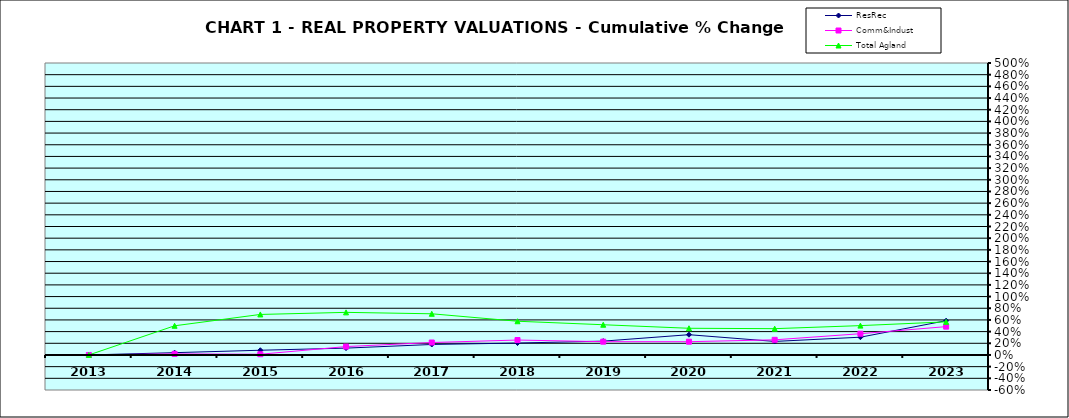
| Category | ResRec | Comm&Indust | Total Agland |
|---|---|---|---|
| 2013.0 | 0 | 0 | 0 |
| 2014.0 | 0.039 | 0.018 | 0.5 |
| 2015.0 | 0.081 | 0.012 | 0.694 |
| 2016.0 | 0.117 | 0.144 | 0.73 |
| 2017.0 | 0.179 | 0.213 | 0.705 |
| 2018.0 | 0.204 | 0.256 | 0.577 |
| 2019.0 | 0.237 | 0.227 | 0.518 |
| 2020.0 | 0.347 | 0.227 | 0.457 |
| 2021.0 | 0.232 | 0.259 | 0.45 |
| 2022.0 | 0.304 | 0.364 | 0.503 |
| 2023.0 | 0.587 | 0.485 | 0.567 |